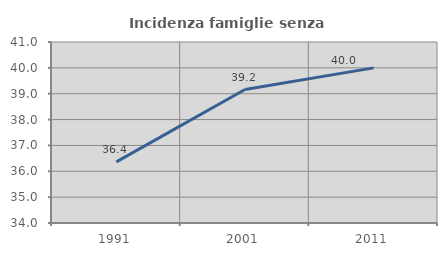
| Category | Incidenza famiglie senza nuclei |
|---|---|
| 1991.0 | 36.364 |
| 2001.0 | 39.163 |
| 2011.0 | 40 |